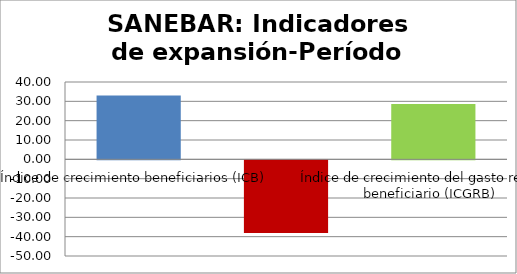
| Category | Series 0 |
|---|---|
| Índice de crecimiento beneficiarios (ICB)  | 33.01 |
| Índice de crecimiento del gasto real (ICGR)  | -37.566 |
| Índice de crecimiento del gasto real por beneficiario (ICGRB)  | 28.556 |